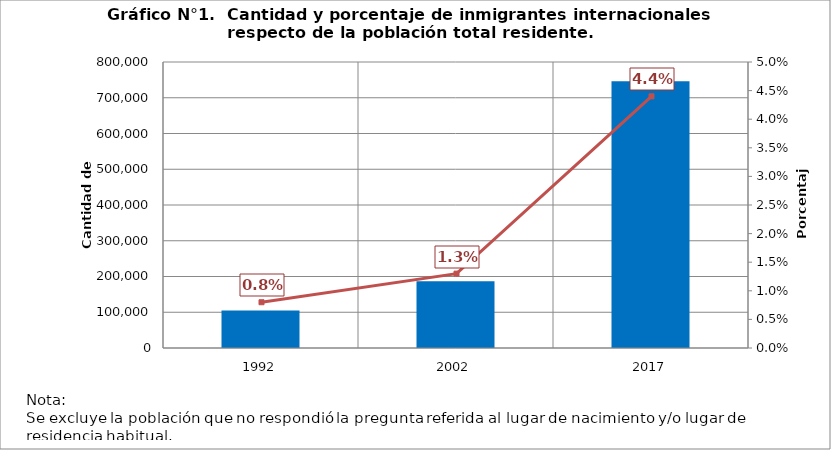
| Category | CANTIDAD |
|---|---|
| 0 | 105070 |
| 1 | 187008 |
| 2 | 746465 |